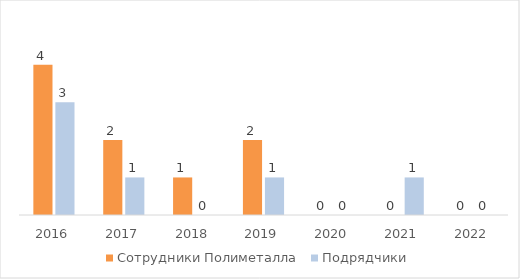
| Category | Сотрудники Полиметалла | Подрядчики |
|---|---|---|
| 2016.0 | 4 | 3 |
| 2017.0 | 2 | 1 |
| 2018.0 | 1 | 0 |
| 2019.0 | 2 | 1 |
| 2020.0 | 0 | 0 |
| 2021.0 | 0 | 1 |
| 2022.0 | 0 | 0 |